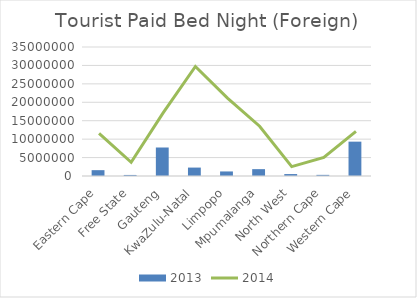
| Category | 2013 |
|---|---|
| Eastern Cape | 1583151 |
| Free State | 285312 |
| Gauteng | 7733288 |
| KwaZulu-Natal | 2284728 |
| Limpopo | 1234924 |
| Mpumalanga | 1859262 |
| North West | 527109 |
| Northern Cape | 307899 |
| Western Cape | 9319411 |